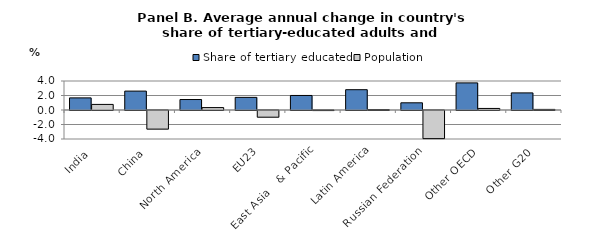
| Category | Share of tertiary educated | Population |
|---|---|---|
| India | 1.671 | 0.771 |
| China | 2.607 | -2.569 |
| North America | 1.446 | 0.332 |
| EU23 | 1.742 | -0.924 |
| East Asia   & Pacific | 2.004 | -0.009 |
| Latin America | 2.8 | 0.058 |
| Russian Federation | 0.992 | -3.88 |
| Other OECD | 3.738 | 0.215 |
| Other G20 | 2.359 | 0.082 |